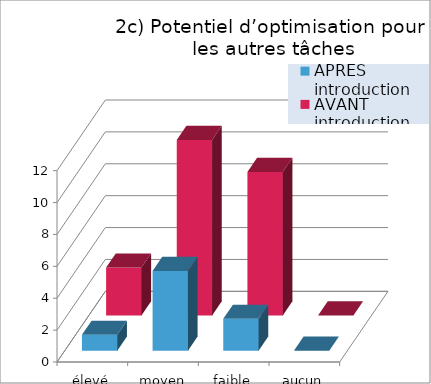
| Category | APRÈS introduction | AVANT introduction |
|---|---|---|
| élevé | 1 | 3 |
| moyen | 5 | 11 |
| faible | 2 | 9 |
| aucun | 0 | 0 |